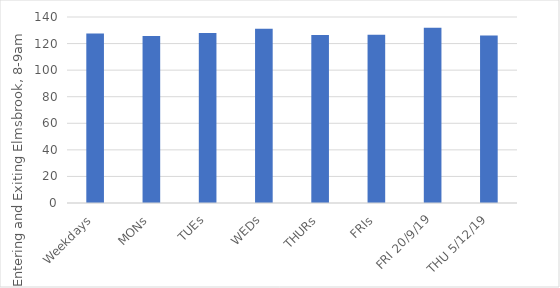
| Category | Total |
|---|---|
| Weekdays | 127.639 |
| MONs | 125.786 |
| TUEs | 128 |
| WEDs | 131.067 |
| THURs | 126.467 |
| FRIs | 126.714 |
| FRI 20/9/19 | 132 |
| THU 5/12/19 | 126 |